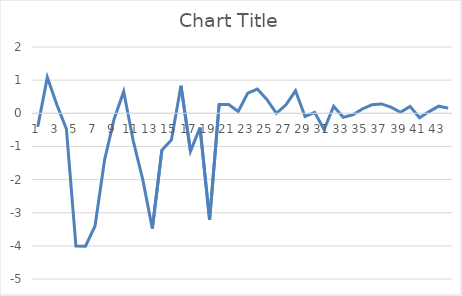
| Category | Series 0 |
|---|---|
| 0 | -0.407 |
| 1 | 1.084 |
| 2 | 0.259 |
| 3 | -0.475 |
| 4 | -4.007 |
| 5 | -4.011 |
| 6 | -3.4 |
| 7 | -1.404 |
| 8 | -0.171 |
| 9 | 0.66 |
| 10 | -0.83 |
| 11 | -2.004 |
| 12 | -3.477 |
| 13 | -1.115 |
| 14 | -0.804 |
| 15 | 0.83 |
| 16 | -1.143 |
| 17 | -0.43 |
| 18 | -3.214 |
| 19 | 0.266 |
| 20 | 0.265 |
| 21 | 0.053 |
| 22 | 0.607 |
| 23 | 0.732 |
| 24 | 0.42 |
| 25 | -0.002 |
| 26 | 0.254 |
| 27 | 0.679 |
| 28 | -0.095 |
| 29 | 0.029 |
| 30 | -0.491 |
| 31 | 0.212 |
| 32 | -0.119 |
| 33 | -0.048 |
| 34 | 0.13 |
| 35 | 0.256 |
| 36 | 0.282 |
| 37 | 0.183 |
| 38 | 0.031 |
| 39 | 0.208 |
| 40 | -0.136 |
| 41 | 0.051 |
| 42 | 0.214 |
| 43 | 0.156 |